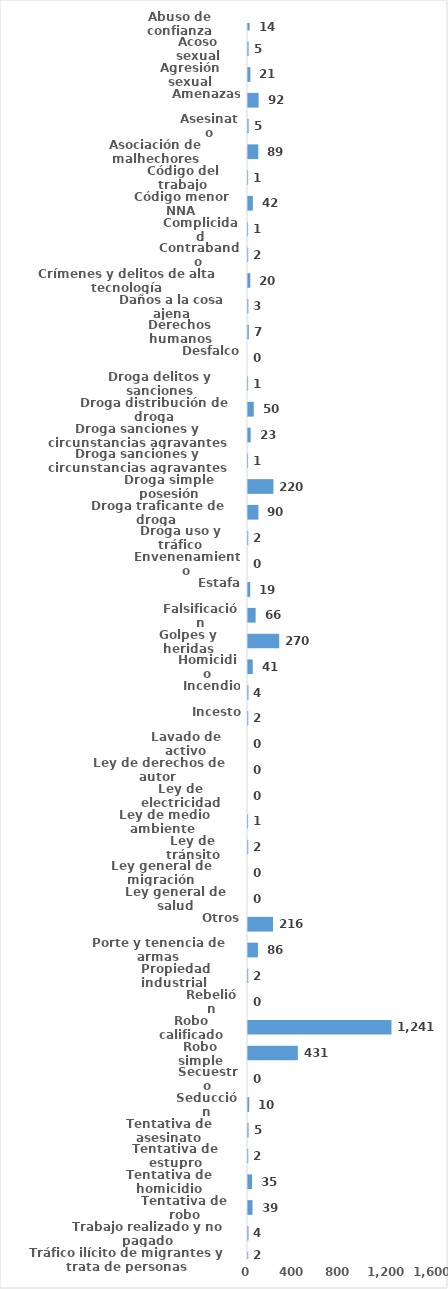
| Category | Series 0 |
|---|---|
| Abuso de confianza | 14 |
| Acoso sexual | 5 |
| Agresión sexual | 21 |
| Amenazas | 92 |
| Asesinato | 5 |
| Asociación de malhechores | 89 |
| Código del trabajo | 1 |
| Código menor NNA | 42 |
| Complicidad | 1 |
| Contrabando | 2 |
| Crímenes y delitos de alta tecnología | 20 |
| Daños a la cosa ajena | 3 |
| Derechos humanos | 7 |
| Desfalco | 0 |
| Droga delitos y sanciones | 1 |
| Droga distribución de droga | 50 |
| Droga sanciones y circunstancias agravantes | 23 |
| Droga sanciones y circunstancias agravantes | 1 |
| Droga simple posesión | 220 |
| Droga traficante de droga  | 90 |
| Droga uso y tráfico | 2 |
| Envenenamiento | 0 |
| Estafa | 19 |
| Falsificación | 66 |
| Golpes y heridas | 270 |
| Homicidio | 41 |
| Incendio | 4 |
| Incesto | 2 |
| Lavado de activo | 0 |
| Ley de derechos de autor  | 0 |
| Ley de electricidad | 0 |
| Ley de medio ambiente  | 1 |
| Ley de tránsito | 2 |
| Ley general de migración | 0 |
| Ley general de salud | 0 |
| Otros | 216 |
| Porte y tenencia de armas | 86 |
| Propiedad industrial  | 2 |
| Rebelión | 0 |
| Robo calificado | 1241 |
| Robo simple | 431 |
| Secuestro | 0 |
| Seducción | 10 |
| Tentativa de asesinato | 5 |
| Tentativa de estupro | 2 |
| Tentativa de homicidio | 35 |
| Tentativa de robo | 39 |
| Trabajo realizado y no pagado | 4 |
| Tráfico ilícito de migrantes y trata de personas | 2 |